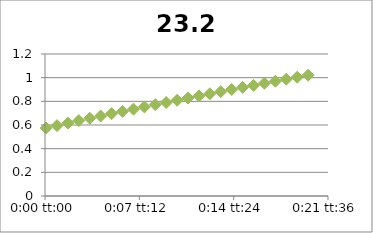
| Category | 23.2 |
|---|---|
| 5.78703703703704e-05 | 0.574 |
| 0.000636574074074074 | 0.595 |
| 0.00121527777777778 | 0.616 |
| 0.00179398148148148 | 0.637 |
| 0.00237268518518518 | 0.657 |
| 0.00295138888888889 | 0.676 |
| 0.00353009259259259 | 0.696 |
| 0.0041087962962963 | 0.715 |
| 0.0046875 | 0.734 |
| 0.0052662037037037 | 0.753 |
| 0.00584490740740741 | 0.772 |
| 0.00642361111111111 | 0.79 |
| 0.00700231481481481 | 0.809 |
| 0.00758101851851852 | 0.828 |
| 0.00815972222222222 | 0.846 |
| 0.00873842592592592 | 0.864 |
| 0.00931712962962963 | 0.882 |
| 0.00989583333333333 | 0.9 |
| 0.010474537037037 | 0.918 |
| 0.0110532407407407 | 0.935 |
| 0.0116319444444444 | 0.953 |
| 0.0122106481481481 | 0.97 |
| 0.0127893518518518 | 0.987 |
| 0.0133680555555556 | 1.004 |
| 0.0139467592592593 | 1.021 |